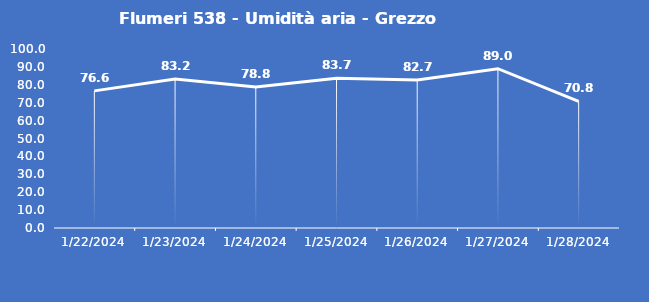
| Category | Flumeri 538 - Umidità aria - Grezzo (%) |
|---|---|
| 1/22/24 | 76.6 |
| 1/23/24 | 83.2 |
| 1/24/24 | 78.8 |
| 1/25/24 | 83.7 |
| 1/26/24 | 82.7 |
| 1/27/24 | 89 |
| 1/28/24 | 70.8 |